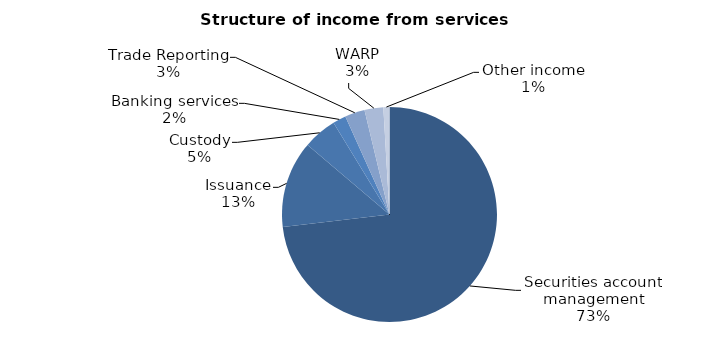
| Category | Series 0 |
|---|---|
| Securities account management | 3552.2 |
| Issuance | 634.6 |
| Custody | 246.1 |
| Banking services | 96.5 |
| Trade Reporting | 145.5 |
| WARP | 137.1 |
| Other income | 44.5 |